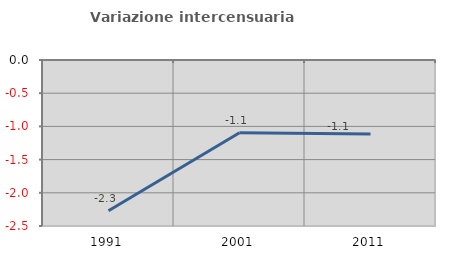
| Category | Variazione intercensuaria annua |
|---|---|
| 1991.0 | -2.27 |
| 2001.0 | -1.096 |
| 2011.0 | -1.113 |